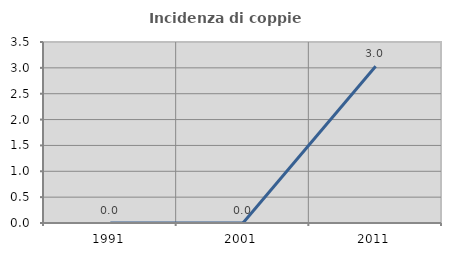
| Category | Incidenza di coppie miste |
|---|---|
| 1991.0 | 0 |
| 2001.0 | 0 |
| 2011.0 | 3.03 |